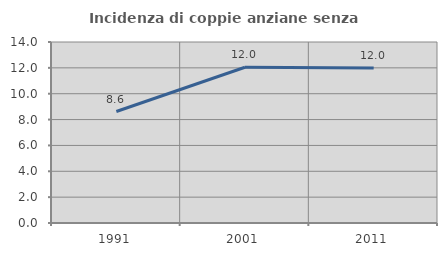
| Category | Incidenza di coppie anziane senza figli  |
|---|---|
| 1991.0 | 8.624 |
| 2001.0 | 12.046 |
| 2011.0 | 11.983 |